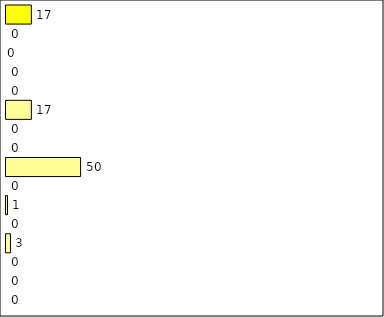
| Category | -2 | -1 | 0 | 1 | 2 | 3 | 4 | 5 | 6 | 7 | 8 | 9 | 10 | 11 | 12 | Perfect Round |
|---|---|---|---|---|---|---|---|---|---|---|---|---|---|---|---|---|
| 0 | 0 | 0 | 0 | 3 | 0 | 1 | 0 | 50 | 0 | 0 | 17 | 0 | 0 | 0 | 0 | 17 |